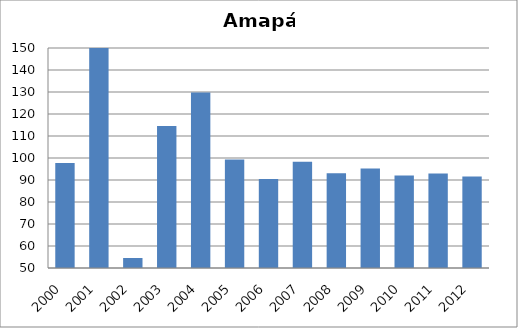
| Category | Tríplice viral/sarampo |
|---|---|
| 2000.0 | 97.78 |
| 2001.0 | 163.82 |
| 2002.0 | 54.55 |
| 2003.0 | 114.5 |
| 2004.0 | 129.76 |
| 2005.0 | 99.34 |
| 2006.0 | 90.41 |
| 2007.0 | 98.29 |
| 2008.0 | 93.02 |
| 2009.0 | 95.19 |
| 2010.0 | 92.1 |
| 2011.0 | 93 |
| 2012.0 | 91.55 |